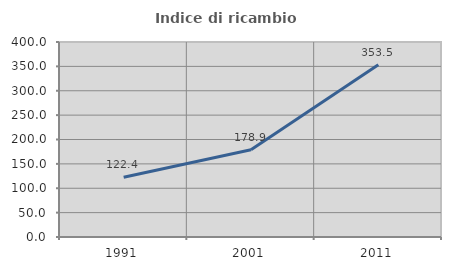
| Category | Indice di ricambio occupazionale  |
|---|---|
| 1991.0 | 122.39 |
| 2001.0 | 178.878 |
| 2011.0 | 353.538 |